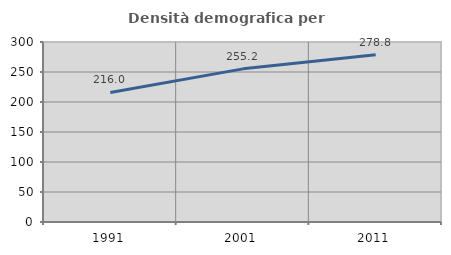
| Category | Densità demografica |
|---|---|
| 1991.0 | 215.993 |
| 2001.0 | 255.24 |
| 2011.0 | 278.815 |